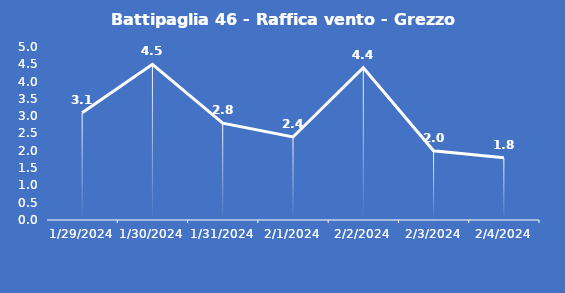
| Category | Battipaglia 46 - Raffica vento - Grezzo (m/s) |
|---|---|
| 1/29/24 | 3.1 |
| 1/30/24 | 4.5 |
| 1/31/24 | 2.8 |
| 2/1/24 | 2.4 |
| 2/2/24 | 4.4 |
| 2/3/24 | 2 |
| 2/4/24 | 1.8 |